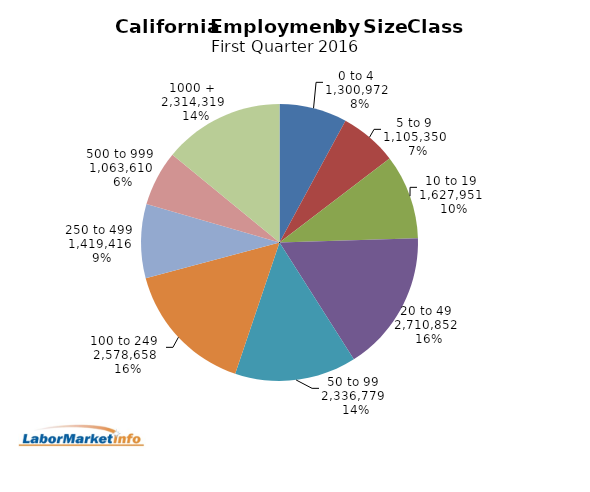
| Category | Series 1 |
|---|---|
| 0 to 4   | 1300972 |
| 5 to 9   | 1105350 |
| 10 to 19   | 1627951 |
| 20 to 49   | 2710852 |
| 50 to 99   | 2336779 |
| 100 to 249   | 2578658 |
| 250 to 499   | 1419416 |
| 500 to 999   | 1063610 |
| 1000 +   | 2314319 |